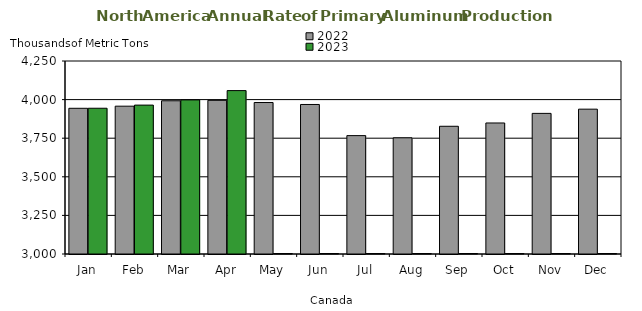
| Category | 2022 | 2023 |
|---|---|---|
| Jan | 3943.766 | 3943.978 |
| Feb | 3957.421 | 3964.33 |
| Mar | 3992.464 | 3997.975 |
| Apr | 3995.314 | 4058.289 |
| May | 3981.031 | 0 |
| Jun | 3968.402 | 0 |
| Jul | 3766.729 | 0 |
| Aug | 3752.647 | 0 |
| Sep | 3827.195 | 0 |
| Oct | 3848.56 | 0 |
| Nov | 3910.719 | 0 |
| Dec | 3938.009 | 0 |